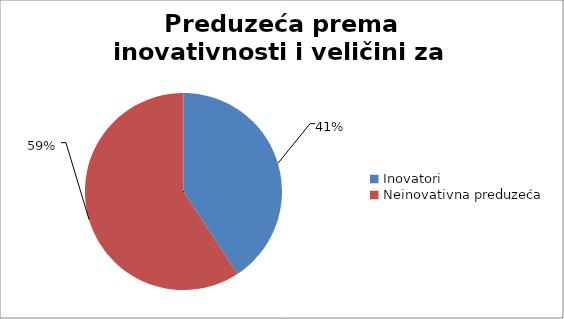
| Category | Preduzeća prema inovativnosti i veličini za period 2016-2018 |
|---|---|
| Inovatori  | 1563 |
| Neinovativna preduzeća    | 2270 |